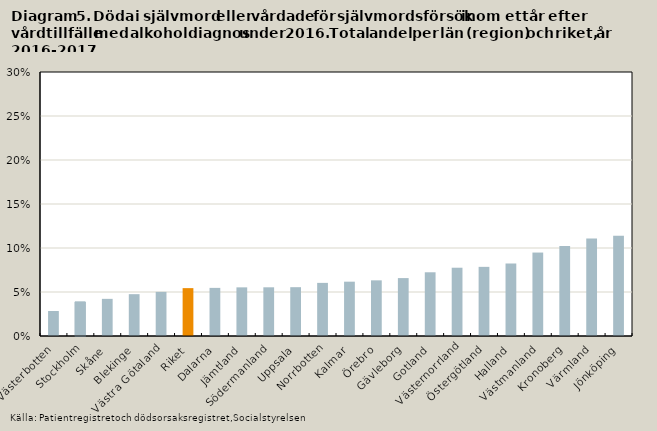
| Category | Totalt |
|---|---|
| Västerbotten | 0.028 |
| Stockholm | 0.039 |
| Skåne | 0.042 |
| Blekinge | 0.048 |
| Västra Götaland | 0.05 |
| Riket | 0.054 |
| Dalarna | 0.055 |
| Jämtland | 0.055 |
| Södermanland | 0.055 |
| Uppsala | 0.055 |
| Norrbotten | 0.06 |
| Kalmar | 0.062 |
| Örebro | 0.063 |
| Gävleborg | 0.066 |
| Gotland | 0.072 |
| Västernorrland | 0.078 |
| Östergötland | 0.079 |
| Halland | 0.082 |
| Västmanland | 0.095 |
| Kronoberg | 0.102 |
| Värmland | 0.111 |
| Jönköping | 0.114 |